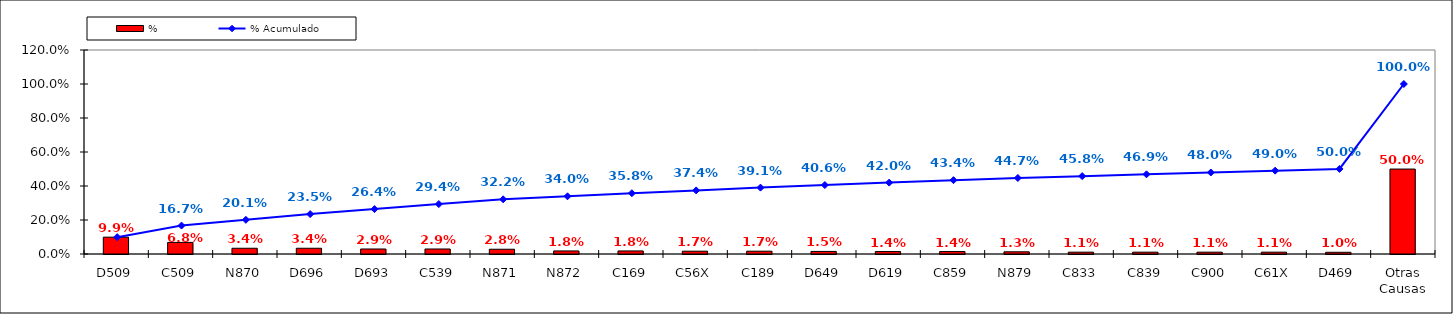
| Category | % |
|---|---|
| D509 | 0.099 |
| C509 | 0.068 |
| N870 | 0.034 |
| D696 | 0.034 |
| D693 | 0.029 |
| C539 | 0.029 |
| N871 | 0.028 |
| N872 | 0.018 |
| C169 | 0.018 |
| C56X | 0.017 |
| C189 | 0.017 |
| D649 | 0.015 |
| D619 | 0.014 |
| C859 | 0.014 |
| N879 | 0.013 |
| C833 | 0.011 |
| C839 | 0.011 |
| C900 | 0.011 |
| C61X | 0.011 |
| D469 | 0.01 |
| Otras Causas | 0.5 |